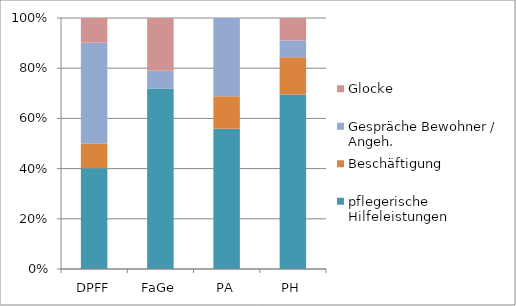
| Category | DPFF | FaGe | PA | PH | pflegerische Hilfeleistungen | Beschäftigung | Gespräche Bewohner / Angeh. | Glocke |
|---|---|---|---|---|---|---|---|---|
| DPFF |  |  |  |  | 490 | 120 | 490 | 120 |
| FaGe |  |  |  |  | 205 | 0 | 20 | 60 |
| PA |  |  |  |  | 260 | 60 | 145 | 0 |
| PH |  |  |  |  | 935 | 200 | 90 | 120 |